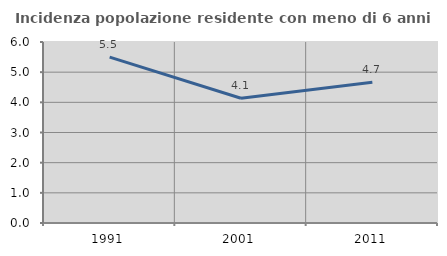
| Category | Incidenza popolazione residente con meno di 6 anni |
|---|---|
| 1991.0 | 5.498 |
| 2001.0 | 4.134 |
| 2011.0 | 4.669 |